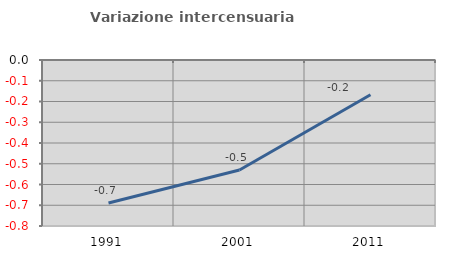
| Category | Variazione intercensuaria annua |
|---|---|
| 1991.0 | -0.689 |
| 2001.0 | -0.53 |
| 2011.0 | -0.168 |